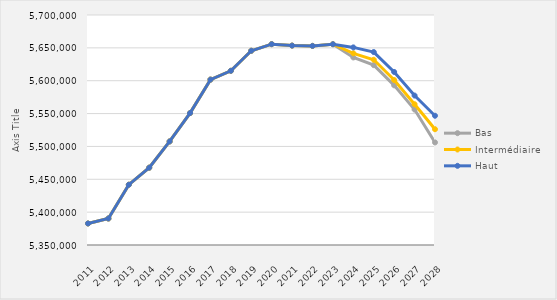
| Category | Bas | Intermédiaire | Haut |
|---|---|---|---|
| 2011 | 5382760 | 5382760 | 5382760 |
| 2012 | 5390332 | 5390332 | 5390332 |
| 2013 | 5441745 | 5441745 | 5441745 |
| 2014 | 5467660 | 5467660 | 5467660 |
| 2015 | 5507612 | 5507612 | 5507612 |
| 2016 | 5550775 | 5550775 | 5550775 |
| 2017 | 5601699 | 5601699 | 5601699 |
| 2018 | 5615100 | 5615100 | 5615100 |
| 2019 | 5645593 | 5645593 | 5645593 |
| 2020 | 5655644 | 5655644 | 5655644 |
| 2021 | 5653435 | 5653435 | 5653435 |
| 2022 | 5652973 | 5652973 | 5652973 |
| 2023 | 5655549 | 5655549 | 5655549 |
| 2024 | 5635400 | 5641700 | 5650700 |
| 2025 | 5623700 | 5631900 | 5643600 |
| 2026 | 5593000 | 5601000 | 5613300 |
| 2027 | 5556100 | 5564200 | 5577400 |
| 2028 | 5506100 | 5526200 | 5546700 |